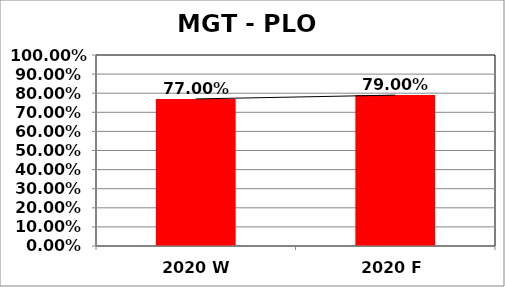
| Category | Series 0 |
|---|---|
| 2020 W | 0.77 |
| 2020 F | 0.79 |